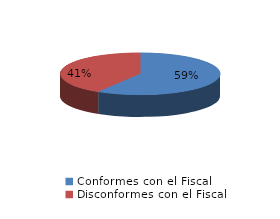
| Category | Series 0 |
|---|---|
| 0 | 122 |
| 1 | 86 |